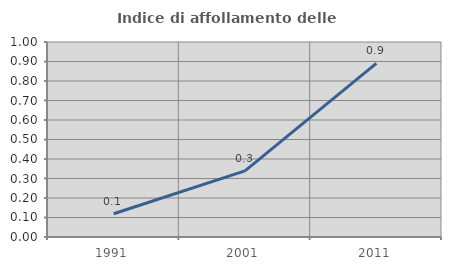
| Category | Indice di affollamento delle abitazioni  |
|---|---|
| 1991.0 | 0.119 |
| 2001.0 | 0.339 |
| 2011.0 | 0.89 |